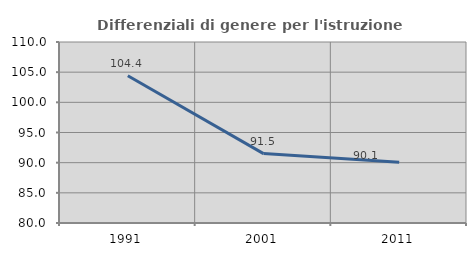
| Category | Differenziali di genere per l'istruzione superiore |
|---|---|
| 1991.0 | 104.415 |
| 2001.0 | 91.506 |
| 2011.0 | 90.056 |